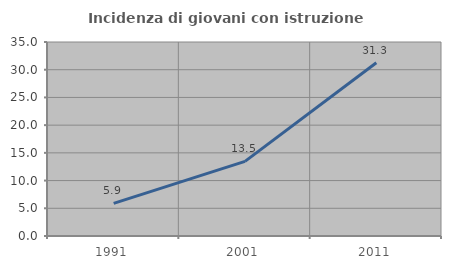
| Category | Incidenza di giovani con istruzione universitaria |
|---|---|
| 1991.0 | 5.882 |
| 2001.0 | 13.462 |
| 2011.0 | 31.25 |